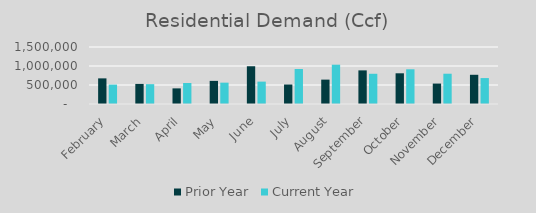
| Category | Prior Year | Current Year |
|---|---|---|
| February | 674439.428 | 510296.309 |
| March | 528549.791 | 521893.674 |
| April | 411179.62 | 552550.404 |
| May | 608563.54 | 561680.927 |
| June | 993563.54 | 588815.728 |
| July | 512849.55 | 920418.723 |
| August | 641515.25 | 1034271.241 |
| September | 884745.885 | 795392.365 |
| October | 808030.57 | 913450.318 |
| November | 537591.016 | 796803.85 |
| December | 768795.205 | 682240.42 |